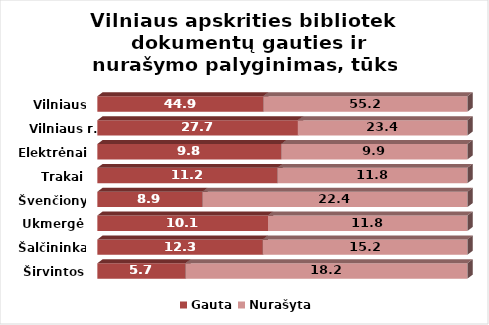
| Category | Gauta | Nurašyta |
|---|---|---|
| Širvintos | 5.7 | 18.2 |
| Šalčininkai | 12.3 | 15.2 |
| Ukmergė | 10.1 | 11.8 |
| Švenčionys | 8.9 | 22.4 |
| Trakai | 11.2 | 11.8 |
| Elektrėnai | 9.8 | 9.9 |
| Vilniaus r. | 27.7 | 23.4 |
| Vilniaus m. | 44.9 | 55.2 |